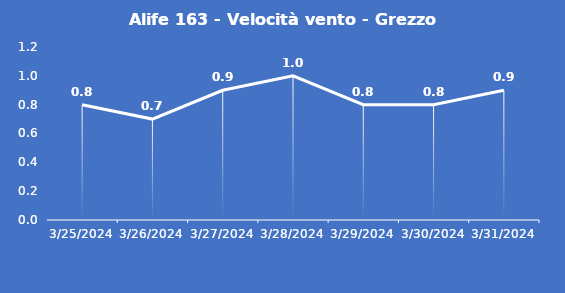
| Category | Alife 163 - Velocità vento - Grezzo (m/s) |
|---|---|
| 3/25/24 | 0.8 |
| 3/26/24 | 0.7 |
| 3/27/24 | 0.9 |
| 3/28/24 | 1 |
| 3/29/24 | 0.8 |
| 3/30/24 | 0.8 |
| 3/31/24 | 0.9 |